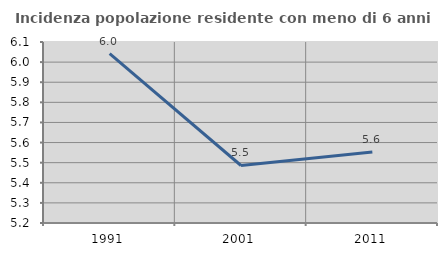
| Category | Incidenza popolazione residente con meno di 6 anni |
|---|---|
| 1991.0 | 6.043 |
| 2001.0 | 5.486 |
| 2011.0 | 5.553 |